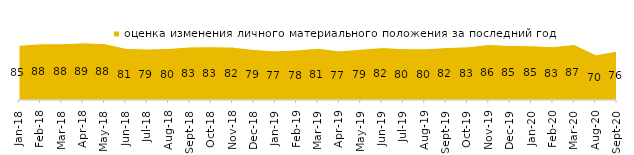
| Category | оценка изменения личного материального положения за последний год |
|---|---|
| 2018-01-01 | 85.15 |
| 2018-02-01 | 87.55 |
| 2018-03-01 | 87.65 |
| 2018-04-01 | 89.15 |
| 2018-05-01 | 87.9 |
| 2018-06-01 | 80.55 |
| 2018-07-01 | 79.45 |
| 2018-08-01 | 80.4 |
| 2018-09-01 | 82.75 |
| 2018-10-01 | 83.05 |
| 2018-11-01 | 82.485 |
| 2018-12-01 | 78.65 |
| 2019-01-01 | 76.7 |
| 2019-02-01 | 77.9 |
| 2019-03-01 | 80.656 |
| 2019-04-01 | 76.584 |
| 2019-05-01 | 79 |
| 2019-06-01 | 81.696 |
| 2019-07-01 | 80.05 |
| 2019-08-01 | 79.77 |
| 2019-09-01 | 81.733 |
| 2019-10-01 | 82.871 |
| 2019-11-01 | 86.436 |
| 2019-12-01 | 85 |
| 2020-01-01 | 84.505 |
| 2020-02-01 | 83.168 |
| 2020-03-01 | 86.564 |
| 2020-08-01 | 70.357 |
| 2020-09-01 | 76.307 |